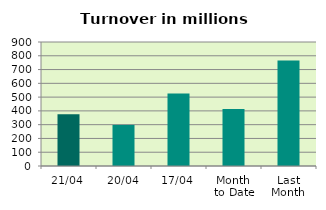
| Category | Series 0 |
|---|---|
| 21/04 | 375.709 |
| 20/04 | 298.432 |
| 17/04 | 526.261 |
| Month 
to Date | 414.195 |
| Last
Month | 765.33 |